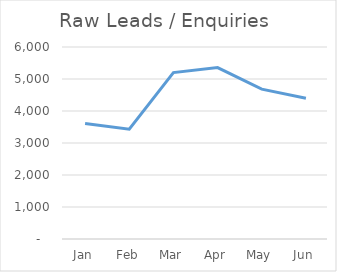
| Category | Raw Leads / Enquiries |
|---|---|
| Jan | 3611 |
| Feb | 3429 |
| Mar | 5200 |
| Apr | 5357 |
| May | 4684 |
| Jun | 4400 |